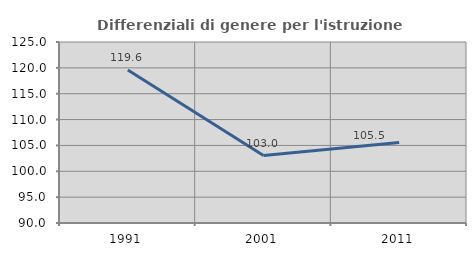
| Category | Differenziali di genere per l'istruzione superiore |
|---|---|
| 1991.0 | 119.589 |
| 2001.0 | 103.049 |
| 2011.0 | 105.545 |